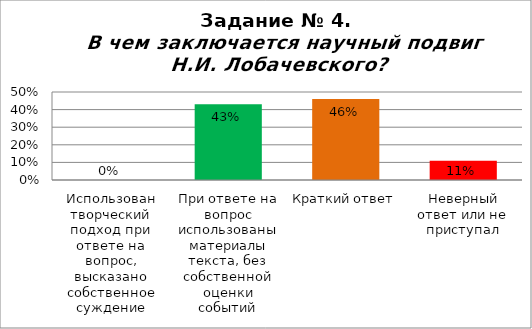
| Category | В чем заключается научный подвиг Н.И. Лобачевского? |
|---|---|
| Использован творческий подход при ответе на вопрос, высказано собственное суждение | 0 |
| При ответе на вопрос использованы материалы текста, без собственной оценки событий | 0.43 |
| Краткий ответ | 0.46 |
| Неверный ответ или не приступал | 0.11 |